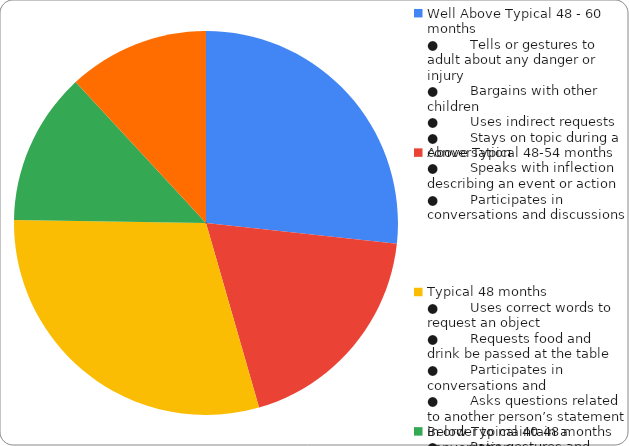
| Category | Series 0 |
|---|---|
| Well Above Typical 48 - 60 months
●        Tells or gestures to adult about any danger or injury
●        Bargains with other children
●        Uses indirect requests
●        Stays on topic during a conversation
 | 0.267 |
| Above Typical 48-54 months
●        Speaks with inflection describing an event or action
●        Participates in conversations and discussions
 | 0.188 |
| Typical 48 months
●        Uses correct words to request an object
●        Requests food and drink be passed at the table
●        Participates in conversations and 
●        Asks questions related to another person’s statement in order to maintain a conv | 0.297 |
| Below Typical 40-48 months
●        Pairs gestures and speech similar to adult level
●        Carries on a conversation
●        Makes conversation repairs when the listener has not understood
●        Requests permission
 | 0.129 |
| Well Below Typical 36-42 months or below
●        Asks “is?” or “do?”
●        Changes speech depending on the listener
●        Talks on the phone and waits for turn to respond
●        Responds to and makes verbal greetings
●        Asks who questions.
● | 0.119 |